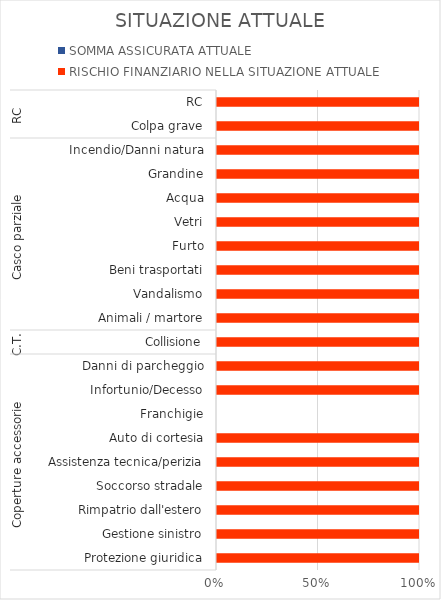
| Category | SOMMA ASSICURATA ATTUALE | RISCHIO FINANZIARIO NELLA SITUAZIONE ATTUALE |
|---|---|---|
| 0 | 0 | 250000 |
| 1 | 0 | 500 |
| 2 | 0 | 10000 |
| 3 | 0 | 5000 |
| 4 | 0 | 500 |
| 5 | 0 | 1000 |
| 6 | 0 | 0 |
| 7 | 0 | 90000 |
| 8 | 0 | 2000 |
| 9 | 0 | 20000 |
| 10 | 0 | 1000 |
| 11 | 0 | 20000 |
| 12 | 0 | 10000 |
| 13 | 0 | 20000 |
| 14 | 0 | 1000 |
| 15 | 0 | 2000 |
| 16 | 0 | 20000 |
| 17 | 0 | 20000 |
| 18 | 0 | 5000000 |
| 19 | 0 | 5000000 |